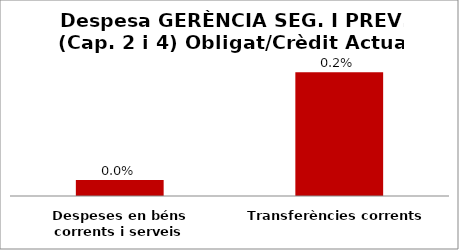
| Category | Series 0 |
|---|---|
| Despeses en béns corrents i serveis | 0 |
| Transferències corrents | 0.002 |